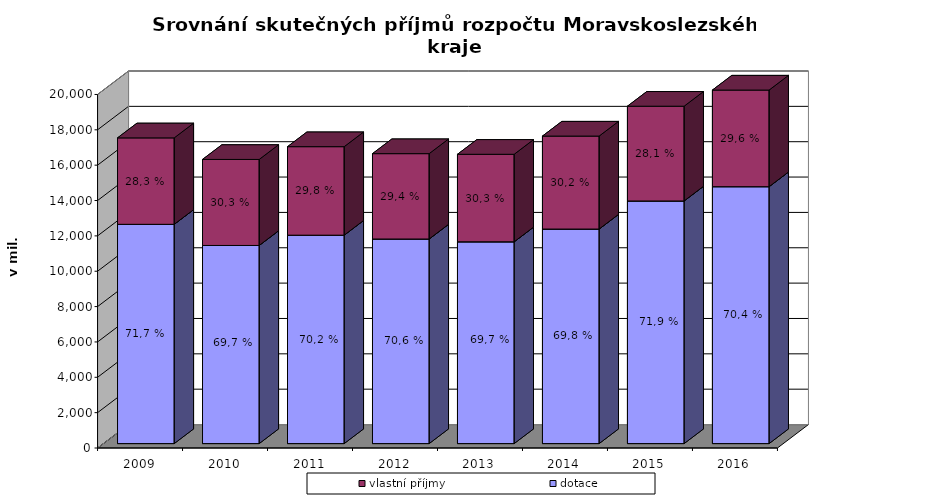
| Category | dotace | vlastní příjmy |
|---|---|---|
| 2009.0 | 12404.835 | 4890.252 |
| 2010.0 | 11209.286 | 4866.207 |
| 2011.0 | 11790.804 | 5006.023 |
| 2012.0 | 11574.909 | 4827.907 |
| 2013.0 | 11415.746 | 4951.1 |
| 2014.0 | 12137.583 | 5259.023 |
| 2015.0 | 13726.48 | 5360.395 |
| 2016.0 | 14534.133 | 6116.069 |